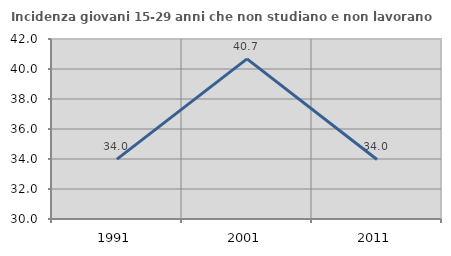
| Category | Incidenza giovani 15-29 anni che non studiano e non lavorano  |
|---|---|
| 1991.0 | 33.995 |
| 2001.0 | 40.674 |
| 2011.0 | 33.97 |